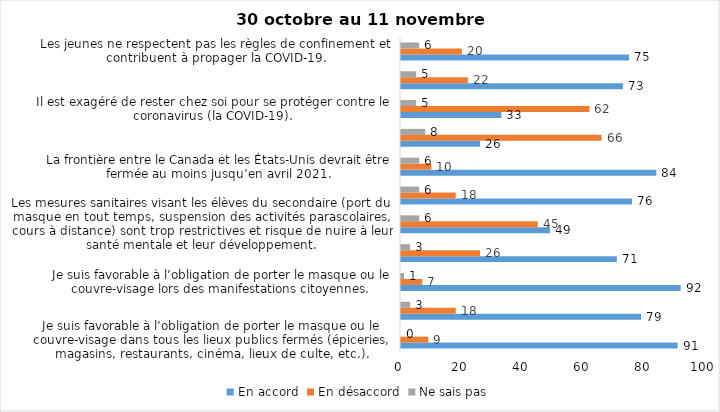
| Category | En accord | En désaccord | Ne sais pas |
|---|---|---|---|
| Je suis favorable à l’obligation de porter le masque ou le couvre-visage dans tous les lieux publics fermés (épiceries, magasins, restaurants, cinéma, lieux de culte, etc.). | 91 | 9 | 0 |
| C’est une bonne chose que les policiers puissent donner facilement des contraventions aux gens qui ne respectent pas les mesures pour prévenir le coronavirus (la COVID-19). | 79 | 18 | 3 |
| Je suis favorable à l’obligation de porter le masque ou le couvre-visage lors des manifestations citoyennes. | 92 | 7 | 1 |
| C’est une bonne chose d’arrêter les activités sportives de groupe (ex. hockey, soccer, yoga, etc.) et de fermer les centres d’entraînement (gyms) dans les zones rouges. | 71 | 26 | 3 |
| Les mesures sanitaires visant les élèves du secondaire (port du masque en tout temps, suspension des activités parascolaires, cours à distance) sont trop restrictives et risque de nuire à leur santé mentale et leur développement. | 49 | 45 | 6 |
| Je suis favorable à l’obligation de porter le masque ou le couvre-visage en tout temps pour les élèves au secondaire. | 76 | 18 | 6 |
| La frontière entre le Canada et les États-Unis devrait être fermée au moins jusqu’en avril 2021. | 84 | 10 | 6 |
| Le gouvernement et les médias exagèrent par rapport au coronavirus (la COVID-19). | 26 | 66 | 8 |
| Il est exagéré de rester chez soi pour se protéger contre le coronavirus (la COVID-19). | 33 | 62 | 5 |
| J’ai peur que le système de santé soit débordé par les cas de COVID-19 suite au «déconfinement». | 73 | 22 | 5 |
| Les jeunes ne respectent pas les règles de confinement et contribuent à propager la COVID-19. | 75 | 20 | 6 |